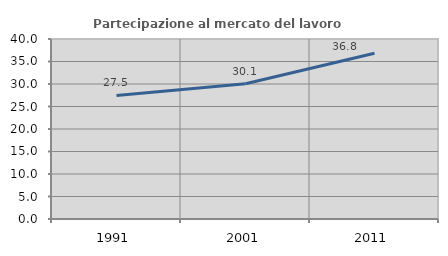
| Category | Partecipazione al mercato del lavoro  femminile |
|---|---|
| 1991.0 | 27.451 |
| 2001.0 | 30.055 |
| 2011.0 | 36.842 |